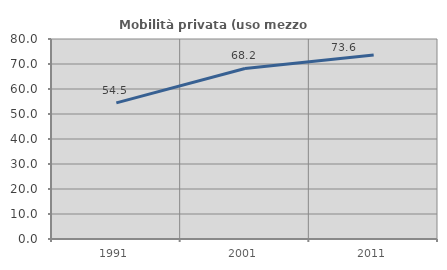
| Category | Mobilità privata (uso mezzo privato) |
|---|---|
| 1991.0 | 54.452 |
| 2001.0 | 68.217 |
| 2011.0 | 73.643 |